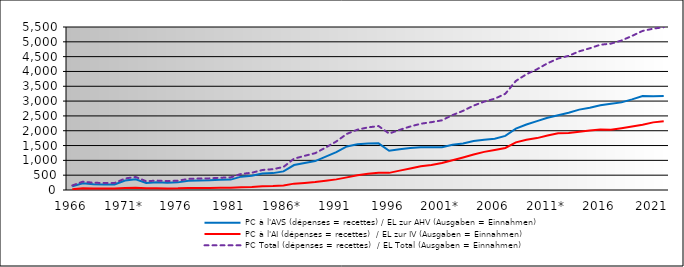
| Category | PC à l'AVS (dépenses = recettes) / EL zur AHV (Ausgaben = Einnahmen) | PC à l'AI (dépenses = recettes)  / EL zur IV (Ausgaben = Einnahmen) | PC Total (dépenses = recettes)  / EL Total (Ausgaben = Einnahmen) |
|---|---|---|---|
| 1966 | 126.5 | 26.23 | 152.7 |
| 1967 | 226.4 | 55.5 | 281.9 |
| 1968 | 196.8 | 46.9 | 243.7 |
| 1969 | 188.2 | 48.4 | 236.6 |
| 1970 | 186.6 | 48.3 | 234.9 |
| 1971* | 318.8 | 70.5 | 389.3 |
| 1972 | 361.8 | 78.1 | 439.9 |
| 1973* | 240.2 | 55 | 295.2 |
| 1974 | 260.9 | 57.1 | 318 |
| 1975* | 244.9 | 54.2 | 299.1 |
| 1976 | 257.31 | 56.468 | 313.778 |
| 1977* | 308.639 | 66.765 | 375.404 |
| 1978 | 320.402 | 68.266 | 388.668 |
| 1979 | 324.956 | 67.367 | 392.323 |
| 1980* | 342.668 | 71.957 | 414.625 |
| 1981 | 351.287 | 74.112 | 425.399 |
| 1982* | 451.003 | 92.674 | 543.676 |
| 1983 | 479.105 | 102.318 | 581.423 |
| 1984* | 552.743 | 123.115 | 675.859 |
| 1985 | 569.744 | 132.401 | 702.145 |
| 1986* | 627.712 | 150.057 | 777.769 |
| 1987 | 842.771 | 214.865 | 1057.636 |
| 1988* | 914.177 | 238.822 | 1152.998 |
| 1989 | 976.667 | 266.759 | 1243.426 |
| 1990* | 1124.361 | 309.276 | 1433.637 |
| 1991 | 1278.948 | 358.825 | 1637.773 |
| 1992* | 1468.464 | 425.959 | 1894.423 |
| 1993* | 1541.4 | 494.324 | 2035.724 |
| 1994 | 1567.014 | 545.391 | 2112.404 |
| 1995* | 1574.969 | 582.655 | 2157.625 |
| 1996 | 1326.084 | 578.382 | 1904.466 |
| 1997* | 1376.393 | 653.179 | 2029.573 |
| 1998* | 1420.22 | 722.712 | 2142.933 |
| 1999* | 1439.061 | 797.884 | 2236.945 |
| 2000 | 1441.041 | 847.199 | 2288.24 |
| 2001* | 1442.446 | 908.764 | 2351.21 |
| 2002 | 1524.761 | 1003.042 | 2527.803 |
| 2003* | 1572.624 | 1098.649 | 2671.272 |
| 2004 | 1650.925 | 1196.53 | 2847.455 |
| 2005* | 1695.394 | 1286.313 | 2981.707 |
| 2006 | 1731.033 | 1349.284 | 3080.317 |
| 2007* | 1827.051 | 1419.188 | 3246.24 |
| 2008 | 2071.681 | 1608.136 | 3679.818 |
| 2009* | 2209.657 | 1696.082 | 3905.739 |
| 2010 | 2323.597 | 1751.109 | 4074.707 |
| 2011* | 2439.047 | 1836.855 | 4275.902 |
| 2012 | 2524.508 | 1911.412 | 4435.92 |
| 2013* | 2604.622 | 1923.238 | 4527.86 |
| 2014 | 2712.078 | 1966.639 | 4678.717 |
| 2015* | 2778.402 | 2003.706 | 4782.108 |
| 2016 | 2856.457 | 2044.889 | 4901.346 |
| 2017 | 2906.71 | 2032.257 | 4938.967 |
| 2018 | 2956.291 | 2087.287 | 5043.577 |
| 2019* | 3057.576 | 2141.607 | 5199.184 |
| 2020 | 3167.562 | 2200.352 | 5367.914 |
| 2021 | 3160.646 | 2282.19 | 5442.836 |
| 2022 | 3169.927 | 2323.437 | 5493.365 |